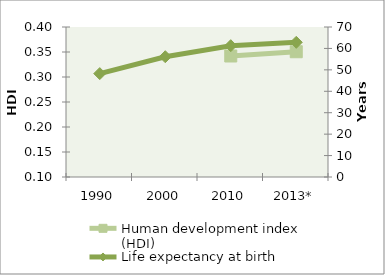
| Category | Human development index (HDI) |
|---|---|
| 1990 | 0 |
| 2000 | 0 |
| 2010 | 0.342 |
| 2013* | 0.351 |